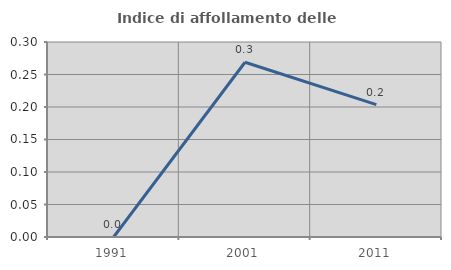
| Category | Indice di affollamento delle abitazioni  |
|---|---|
| 1991.0 | 0 |
| 2001.0 | 0.269 |
| 2011.0 | 0.204 |